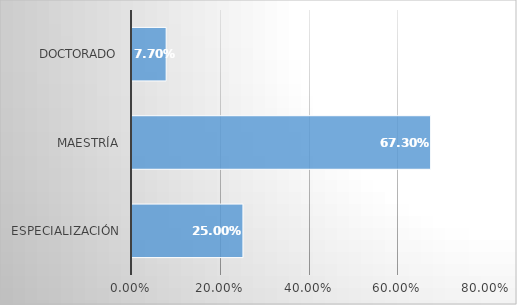
| Category | Series 0 |
|---|---|
| Especialización | 0.25 |
| Maestría | 0.673 |
| Doctorado | 0.077 |